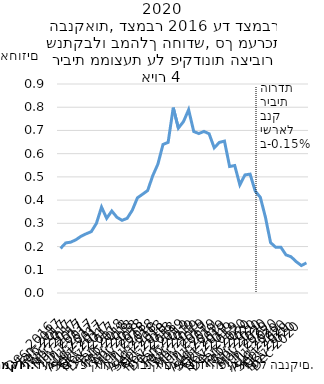
| Category | ריבית ממוצעת על פיקדונות הציבור שנתקבלו במהלך החודש |
|---|---|
| 2016-12-31 | 0.192 |
| 2017-01-31 | 0.216 |
| 2017-02-28 | 0.219 |
| 2017-03-31 | 0.229 |
| 2017-04-30 | 0.244 |
| 2017-05-31 | 0.255 |
| 2017-06-30 | 0.264 |
| 2017-07-31 | 0.3 |
| 2017-08-31 | 0.37 |
| 2017-09-30 | 0.322 |
| 2017-10-31 | 0.353 |
| 2017-11-30 | 0.326 |
| 2017-12-31 | 0.313 |
| 2018-01-31 | 0.322 |
| 2018-02-28 | 0.356 |
| 2018-03-31 | 0.41 |
| 2018-04-30 | 0.425 |
| 2018-05-31 | 0.441 |
| 2018-06-30 | 0.505 |
| 2018-07-31 | 0.555 |
| 2018-08-31 | 0.64 |
| 2018-09-30 | 0.649 |
| 2018-10-31 | 0.798 |
| 2018-11-30 | 0.71 |
| 2018-12-31 | 0.738 |
| 2019-01-31 | 0.789 |
| 2019-02-28 | 0.695 |
| 2019-03-31 | 0.687 |
| 2019-04-30 | 0.696 |
| 2019-05-31 | 0.686 |
| 2019-06-30 | 0.625 |
| 2019-07-31 | 0.648 |
| 2019-08-31 | 0.654 |
| 2019-09-30 | 0.545 |
| 2019-10-31 | 0.549 |
| 2019-11-30 | 0.466 |
| 2019-12-31 | 0.509 |
| 2020-01-31 | 0.512 |
| 2020-02-29 | 0.439 |
| 2020-03-31 | 0.412 |
| 2020-04-30 | 0.326 |
| 2020-05-31 | 0.217 |
| 2020-06-30 | 0.197 |
| 2020-07-31 | 0.197 |
| 2020-08-31 | 0.164 |
| 2020-09-30 | 0.156 |
| 2020-10-31 | 0.135 |
| 2020-11-30 | 0.118 |
| 2020-12-31 | 0.13 |